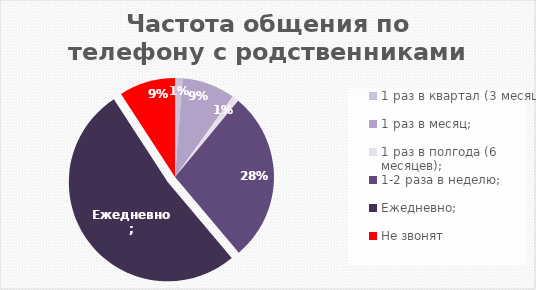
| Category | Итог |
|---|---|
| 1 раз в квартал (3 месяца); | 54 |
| 1 раз в месяц; | 381 |
| 1 раз в полгода (6 месяцев); | 48 |
| 1-2 раза в неделю; | 1222 |
| Ежедневно; | 2282 |
| Не звонят | 403 |